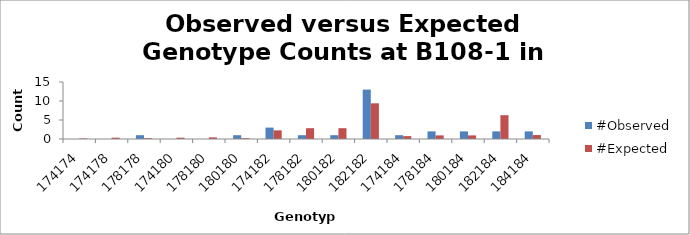
| Category | #Observed | #Expected |
|---|---|---|
| 174174.0 | 0 | 0.138 |
| 174178.0 | 0 | 0.345 |
| 178178.0 | 1 | 0.216 |
| 174180.0 | 0 | 0.345 |
| 178180.0 | 0 | 0.431 |
| 180180.0 | 1 | 0.216 |
| 174182.0 | 3 | 2.276 |
| 178182.0 | 1 | 2.845 |
| 180182.0 | 1 | 2.845 |
| 182182.0 | 13 | 9.388 |
| 174184.0 | 1 | 0.759 |
| 178184.0 | 2 | 0.948 |
| 180184.0 | 2 | 0.948 |
| 182184.0 | 2 | 6.259 |
| 184184.0 | 2 | 1.043 |